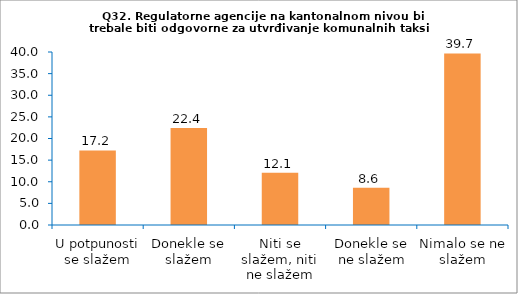
| Category | Series 0 |
|---|---|
| U potpunosti se slažem | 17.241 |
| Donekle se slažem | 22.414 |
| Niti se slažem, niti ne slažem | 12.069 |
| Donekle se ne slažem | 8.621 |
| Nimalo se ne slažem | 39.655 |